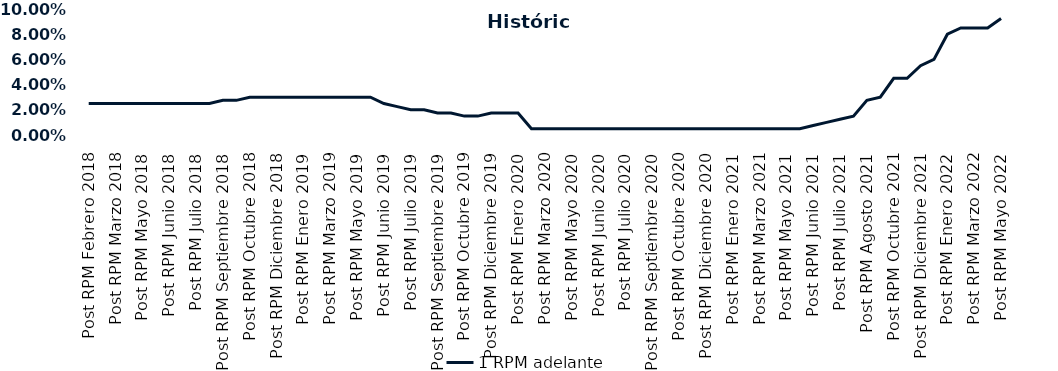
| Category | 1 RPM adelante |
|---|---|
| Post RPM Febrero 2018 | 0.025 |
| Pre RPM Marzo 2018 | 0.025 |
| Post RPM Marzo 2018 | 0.025 |
| Pre RPM Mayo 2018 | 0.025 |
| Post RPM Mayo 2018 | 0.025 |
| Pre RPM Junio 2018 | 0.025 |
| Post RPM Junio 2018 | 0.025 |
| Pre RPM Julio 2018 | 0.025 |
| Post RPM Julio 2018 | 0.025 |
| Pre RPM Septiembre 2018 | 0.025 |
| Post RPM Septiembre 2018 | 0.028 |
| Pre RPM Octubre 2018 | 0.028 |
| Post RPM Octubre 2018 | 0.03 |
| Pre RPM Diciembre 2018 | 0.03 |
| Post RPM Diciembre 2018 | 0.03 |
| Pre RPM Enero 2019 | 0.03 |
| Post RPM Enero 2019 | 0.03 |
| Pre RPM Marzo 2019 | 0.03 |
| Post RPM Marzo 2019 | 0.03 |
| Pre RPM Mayo 2019 | 0.03 |
| Post RPM Mayo 2019 | 0.03 |
| Pre RPM Junio 2019 | 0.03 |
| Post RPM Junio 2019 | 0.025 |
| Pre RPM Julio 2019 | 0.022 |
| Post RPM Julio 2019 | 0.02 |
| Pre RPM Septiembre 2019 | 0.02 |
| Post RPM Septiembre 2019 | 0.018 |
| Pre RPM Octubre 2019 | 0.018 |
| Post RPM Octubre 2019 | 0.015 |
| Pre RPM Diciembre 2019 | 0.015 |
| Post RPM Diciembre 2019 | 0.018 |
| Pre RPM Enero 2020 | 0.018 |
| Post RPM Enero 2020 | 0.018 |
| Pre RPM Marzo 2020 | 0.005 |
| Post RPM Marzo 2020 | 0.005 |
| Pre RPM Mayo 2020 | 0.005 |
| Post RPM Mayo 2020 | 0.005 |
| Pre RPM Junio 2020 | 0.005 |
| Post RPM Junio 2020 | 0.005 |
| Pre RPM Julio 2020 | 0.005 |
| Post RPM Julio 2020 | 0.005 |
| Pre RPM Septiembre 2020 | 0.005 |
| Post RPM Septiembre 2020 | 0.005 |
| Pre RPM Octubre 2020 | 0.005 |
| Post RPM Octubre 2020 | 0.005 |
| Pre RPM Diciembre 2020 | 0.005 |
| Post RPM Diciembre 2020 | 0.005 |
| Pre RPM Enero 2021 | 0.005 |
| Post RPM Enero 2021 | 0.005 |
| Pre RPM Marzo 2021 | 0.005 |
| Post RPM Marzo 2021 | 0.005 |
| Pre RPM Mayo 2021 | 0.005 |
| Post RPM Mayo 2021 | 0.005 |
| Pre RPM Junio 2021 | 0.005 |
| Post RPM Junio 2021 | 0.008 |
| Pre RPM Julio 2021 | 0.01 |
| Post RPM Julio 2021 | 0.012 |
| Pre RPM Agosto 2021 | 0.015 |
| Post RPM Agosto 2021 | 0.028 |
| Pre RPM Octubre 2021 | 0.03 |
| Post RPM Octubre 2021 | 0.045 |
| Pre RPM Diciembre 2021 | 0.045 |
| Post RPM Diciembre 2021 | 0.055 |
| Pre RPM Enero 2022 | 0.06 |
| Post RPM Enero 2022 | 0.08 |
| Pre RPM Marzo 2022 | 0.085 |
| Post RPM Marzo 2022 | 0.085 |
| Pre RPM Mayo 2022 | 0.085 |
| Post RPM Mayo 2022 | 0.092 |